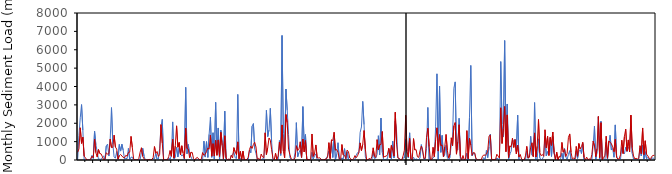
| Category | Observed (metric tons/month) | Baseline calibrated (metric tons/month) |
|---|---|---|
| 1984-01-01 | 18.237 | 419.9 |
| 1984-02-01 | 1337.725 | 606.7 |
| 1984-03-01 | 2298.175 | 1753 |
| 1984-04-01 | 3014.526 | 903.8 |
| 1984-05-01 | 1623.83 | 1238 |
| 1984-06-01 | 12.873 | 210 |
| 1984-07-01 | 5.92 | 122.1 |
| 1984-08-01 | 10.05 | 2.722 |
| 1984-09-01 | 2.417 | 1.407 |
| 1984-10-01 | 3.216 | 0.614 |
| 1984-11-01 | 3.013 | 53.38 |
| 1984-12-01 | 257.169 | 209.7 |
| 1985-01-01 | 74.372 | 113.1 |
| 1985-02-01 | 1566.892 | 1139 |
| 1985-03-01 | 822.888 | 398.6 |
| 1985-04-01 | 470.529 | 166.8 |
| 1985-05-01 | 28.497 | 567.2 |
| 1985-06-01 | 52.116 | 354.7 |
| 1985-07-01 | 27.138 | 331.9 |
| 1985-08-01 | 132.373 | 180.6 |
| 1985-09-01 | 226.883 | 13.53 |
| 1985-10-01 | 5.877 | 29.47 |
| 1985-11-01 | 768.31 | 397.5 |
| 1985-12-01 | 866.247 | 311.5 |
| 1986-01-01 | 215.453 | 342.7 |
| 1986-02-01 | 1116.618 | 1138 |
| 1986-03-01 | 2850.864 | 678.1 |
| 1986-04-01 | 862.45 | 688.6 |
| 1986-05-01 | 167.705 | 1350 |
| 1986-06-01 | 97.042 | 705.7 |
| 1986-07-01 | 460.945 | 594.3 |
| 1986-08-01 | 12.994 | 39.82 |
| 1986-09-01 | 843.506 | 238.8 |
| 1986-10-01 | 485.02 | 299.6 |
| 1986-11-01 | 856.746 | 219.2 |
| 1986-12-01 | 527.262 | 137.9 |
| 1987-01-01 | 35.62 | 118.7 |
| 1987-02-01 | 90.238 | 255.4 |
| 1987-03-01 | 72.475 | 211.9 |
| 1987-04-01 | 631.393 | 412.2 |
| 1987-05-01 | 22.27 | 424.9 |
| 1987-06-01 | 153.491 | 1284 |
| 1987-07-01 | 152.497 | 678.3 |
| 1987-08-01 | 7.005 | 54.03 |
| 1987-09-01 | 3.405 | 2.122 |
| 1987-10-01 | 2.306 | 3.298 |
| 1987-11-01 | 2.149 | 2.469 |
| 1987-12-01 | 34.902 | 86.29 |
| 1988-01-01 | 27.777 | 427.9 |
| 1988-02-01 | 425.847 | 665.7 |
| 1988-03-01 | 639.316 | 198.1 |
| 1988-04-01 | 218.288 | 60.49 |
| 1988-05-01 | 2.362 | 1.206 |
| 1988-06-01 | 1.218 | 0.077 |
| 1988-07-01 | 0.473 | 7.006 |
| 1988-08-01 | 4.261 | 31.86 |
| 1988-09-01 | 2.205 | 1.596 |
| 1988-10-01 | 0.387 | 34.88 |
| 1988-11-01 | 103.259 | 125.1 |
| 1988-12-01 | 60.123 | 730.8 |
| 1989-01-01 | 363.445 | 367.2 |
| 1989-02-01 | 50.415 | 465.2 |
| 1989-03-01 | 48.107 | 192.4 |
| 1989-04-01 | 637.109 | 304.9 |
| 1989-05-01 | 1825.149 | 1926 |
| 1989-06-01 | 2212.087 | 922.6 |
| 1989-07-01 | 62.816 | 12.87 |
| 1989-08-01 | 3.097 | 1.241 |
| 1989-09-01 | 1.41 | 11.61 |
| 1989-10-01 | 27.507 | 18.53 |
| 1989-11-01 | 125.078 | 191.8 |
| 1989-12-01 | 17.784 | 512.9 |
| 1990-01-01 | 261.853 | 204.4 |
| 1990-02-01 | 2072.555 | 1128 |
| 1990-03-01 | 17.161 | 104.1 |
| 1990-04-01 | 138.208 | 768.7 |
| 1990-05-01 | 689.327 | 1859 |
| 1990-06-01 | 169.718 | 696.1 |
| 1990-07-01 | 675.633 | 953.2 |
| 1990-08-01 | 336.939 | 283 |
| 1990-09-01 | 220.621 | 775.4 |
| 1990-10-01 | 284.828 | 376.6 |
| 1990-11-01 | 13.102 | 86.23 |
| 1990-12-01 | 3952.117 | 1732 |
| 1991-01-01 | 340.087 | 626.9 |
| 1991-02-01 | 844.513 | 596.7 |
| 1991-03-01 | 312.076 | 126.5 |
| 1991-04-01 | 180.951 | 418.4 |
| 1991-05-01 | 27.38 | 410.3 |
| 1991-06-01 | 16.947 | 80.86 |
| 1991-07-01 | 1.769 | 2.002 |
| 1991-08-01 | 1.899 | 101.6 |
| 1991-09-01 | 1.09 | 140.3 |
| 1991-10-01 | 0.7 | 53.04 |
| 1991-11-01 | 0.665 | 3.662 |
| 1991-12-01 | 0.873 | 59.4 |
| 1992-01-01 | 37.399 | 405 |
| 1992-02-01 | 1027.606 | 252.4 |
| 1992-03-01 | 159.155 | 307.5 |
| 1992-04-01 | 998.463 | 471 |
| 1992-05-01 | 143.149 | 650 |
| 1992-06-01 | 1396.945 | 588.2 |
| 1992-07-01 | 2331.04 | 1347 |
| 1992-08-01 | 144.429 | 208.6 |
| 1992-09-01 | 1483.442 | 888.5 |
| 1992-10-01 | 50.57 | 214.7 |
| 1992-11-01 | 3138.584 | 1065 |
| 1992-12-01 | 426.621 | 254.7 |
| 1993-01-01 | 1743.16 | 1092 |
| 1993-02-01 | 8.141 | 193.9 |
| 1993-03-01 | 1619.723 | 1502 |
| 1993-04-01 | 950.644 | 785.8 |
| 1993-05-01 | 5.236 | 49.13 |
| 1993-06-01 | 2658.913 | 1318 |
| 1993-07-01 | 21.796 | 117 |
| 1993-08-01 | 2.073 | 1.356 |
| 1993-09-01 | 1.396 | 49.4 |
| 1993-10-01 | 1.434 | 2.067 |
| 1993-11-01 | 246.705 | 260.4 |
| 1993-12-01 | 275.587 | 110.1 |
| 1994-01-01 | 445.244 | 674.2 |
| 1994-02-01 | 122.165 | 441.6 |
| 1994-03-01 | 74.811 | 283 |
| 1994-04-01 | 3568.841 | 986.3 |
| 1994-05-01 | 2.433 | 72.42 |
| 1994-06-01 | 93.152 | 467.5 |
| 1994-07-01 | 3.881 | 18.22 |
| 1994-08-01 | 20.778 | 479.4 |
| 1994-09-01 | 0.886 | 0.458 |
| 1994-10-01 | 0.61 | 0.022 |
| 1994-11-01 | 0.57 | 26.26 |
| 1994-12-01 | 5 | 142.9 |
| 1995-01-01 | 535.513 | 577.2 |
| 1995-02-01 | 392.208 | 753.8 |
| 1995-03-01 | 1841.769 | 630.3 |
| 1995-04-01 | 1983.535 | 840.8 |
| 1995-05-01 | 615.333 | 968.1 |
| 1995-06-01 | 354.996 | 705.9 |
| 1995-07-01 | 37.889 | 26.63 |
| 1995-08-01 | 4.166 | 94.13 |
| 1995-09-01 | 0.633 | 0.446 |
| 1995-10-01 | 1.318 | 325.3 |
| 1995-11-01 | 76.127 | 166.2 |
| 1995-12-01 | 0.723 | 123.2 |
| 1996-01-01 | 1155.987 | 1479 |
| 1996-02-01 | 2704.094 | 299.1 |
| 1996-03-01 | 1273.229 | 672.1 |
| 1996-04-01 | 1641.653 | 1199 |
| 1996-05-01 | 2811.416 | 1078 |
| 1996-06-01 | 988.713 | 560.3 |
| 1996-07-01 | 4.223 | 94.94 |
| 1996-08-01 | 1.374 | 4.724 |
| 1996-09-01 | 1.172 | 369.8 |
| 1996-10-01 | 0.633 | 15.13 |
| 1996-11-01 | 3.649 | 218.7 |
| 1996-12-01 | 1058.524 | 966.5 |
| 1997-01-01 | 252.333 | 364.1 |
| 1997-02-01 | 6775.143 | 1908 |
| 1997-03-01 | 1447.044 | 486.1 |
| 1997-04-01 | 486.074 | 115.9 |
| 1997-05-01 | 3863.677 | 2475 |
| 1997-06-01 | 2693.792 | 2036 |
| 1997-07-01 | 1394.294 | 590 |
| 1997-08-01 | 140.709 | 301.2 |
| 1997-09-01 | 32.709 | 71.19 |
| 1997-10-01 | 0.708 | 8.837 |
| 1997-11-01 | 11.701 | 9.434 |
| 1997-12-01 | 397.304 | 116.6 |
| 1998-01-01 | 2032.763 | 776.7 |
| 1998-02-01 | 168.952 | 515.4 |
| 1998-03-01 | 400.715 | 590.9 |
| 1998-04-01 | 551.67 | 990.3 |
| 1998-05-01 | 116.273 | 144.2 |
| 1998-06-01 | 2905.096 | 1142 |
| 1998-07-01 | 859.278 | 438.8 |
| 1998-08-01 | 1385.801 | 1055 |
| 1998-09-01 | 1.512 | 38.02 |
| 1998-10-01 | 0.769 | 20.65 |
| 1998-11-01 | 0.662 | 18.69 |
| 1998-12-01 | 1.14 | 41.98 |
| 1999-01-01 | 413.93 | 1415 |
| 1999-02-01 | 46.918 | 199.8 |
| 1999-03-01 | 229.77 | 367 |
| 1999-04-01 | 333.581 | 819.2 |
| 1999-05-01 | 1.808 | 116.9 |
| 1999-06-01 | 3.336 | 109.3 |
| 1999-07-01 | 23.599 | 122.4 |
| 1999-08-01 | 5.068 | 34.18 |
| 1999-09-01 | 1.106 | 8.473 |
| 1999-10-01 | 0.676 | 5.806 |
| 1999-11-01 | 0.648 | 39.5 |
| 1999-12-01 | 105.719 | 50.81 |
| 2000-01-01 | 218.759 | 167.3 |
| 2000-02-01 | 492.972 | 943.2 |
| 2000-03-01 | 85.375 | 81.26 |
| 2000-04-01 | 1000.089 | 1099 |
| 2000-05-01 | 139.279 | 1059 |
| 2000-06-01 | 1342.229 | 1511 |
| 2000-07-01 | 12.009 | 536.2 |
| 2000-08-01 | 316.447 | 566.3 |
| 2000-09-01 | 938.897 | 420.7 |
| 2000-10-01 | 50.026 | 59.12 |
| 2000-11-01 | 0.96 | 31.93 |
| 2000-12-01 | 119.751 | 841.3 |
| 2001-01-01 | 31.9 | 277.2 |
| 2001-02-01 | 620.581 | 254.5 |
| 2001-03-01 | 64.511 | 74.49 |
| 2001-04-01 | 447.293 | 539.2 |
| 2001-05-01 | 24.099 | 455.6 |
| 2001-06-01 | 6.391 | 107.4 |
| 2001-07-01 | 1.561 | 44.82 |
| 2001-08-01 | 0.935 | 1.397 |
| 2001-09-01 | 0.612 | 63.36 |
| 2001-10-01 | 27.783 | 239 |
| 2001-11-01 | 253.345 | 124.4 |
| 2001-12-01 | 400.697 | 231.4 |
| 2002-01-01 | 379.49 | 416.1 |
| 2002-02-01 | 1503.222 | 931.4 |
| 2002-03-01 | 1797.24 | 511.9 |
| 2002-04-01 | 3188.652 | 848.6 |
| 2002-05-01 | 1926.875 | 1601 |
| 2002-06-01 | 173.143 | 600.5 |
| 2002-07-01 | 1.725 | 1.224 |
| 2002-08-01 | 1.22 | 3.862 |
| 2002-09-01 | 1.986 | 93.11 |
| 2002-10-01 | 0.796 | 25.96 |
| 2002-11-01 | 9.597 | 179 |
| 2002-12-01 | 479.962 | 662.8 |
| 2003-01-01 | 87.147 | 203.1 |
| 2003-02-01 | 102.929 | 135.5 |
| 2003-03-01 | 307.796 | 1107 |
| 2003-04-01 | 1321.139 | 552.6 |
| 2003-05-01 | 284.193 | 831.8 |
| 2003-06-01 | 2282.287 | 842.7 |
| 2003-07-01 | 404.796 | 1550 |
| 2003-08-01 | 32.277 | 147.7 |
| 2003-09-01 | 10.973 | 199.7 |
| 2003-10-01 | 41.882 | 203.4 |
| 2003-11-01 | 64.875 | 292.9 |
| 2003-12-01 | 592.714 | 639.7 |
| 2004-01-01 | 480.92 | 122.7 |
| 2004-02-01 | 31.046 | 789.8 |
| 2004-03-01 | 1024.99 | 538.5 |
| 2004-04-01 | 110.072 | 209.4 |
| 2004-05-01 | 2108.749 | 2600 |
| 2004-06-01 | 1522.835 | 867.2 |
| 2004-07-01 | 135.156 | 110.9 |
| 2004-08-01 | 51.459 | 93.11 |
| 2004-09-01 | 0.923 | 8.294 |
| 2004-10-01 | 0.621 | 5.478 |
| 2004-11-01 | 116.252 | 225.7 |
| 2004-12-01 | 107.839 | 533.9 |
| 2005-01-01 | 1112.792 | 2432 |
| 2005-02-01 | 395.542 | 484.3 |
| 2005-03-01 | 117.081 | 161.7 |
| 2005-04-01 | 1477.958 | 1173 |
| 2005-05-01 | 6.426 | 60.74 |
| 2005-06-01 | 2.286 | 1.77 |
| 2005-07-01 | 153.909 | 1164 |
| 2005-08-01 | 4.252 | 543.5 |
| 2005-09-01 | 61.66 | 563.1 |
| 2005-10-01 | 27.626 | 175 |
| 2005-11-01 | 1.826 | 141.8 |
| 2005-12-01 | 111.142 | 501.8 |
| 2006-01-01 | 837.56 | 759.9 |
| 2006-02-01 | 433.977 | 554.8 |
| 2006-03-01 | 46.85 | 81.12 |
| 2006-04-01 | 14.796 | 100.5 |
| 2006-05-01 | 628.836 | 1236 |
| 2006-06-01 | 2857.52 | 1729 |
| 2006-07-01 | 41.612 | 728.1 |
| 2006-08-01 | 3.128 | 17.14 |
| 2006-09-01 | 0.909 | 9.707 |
| 2006-10-01 | 130.773 | 688.3 |
| 2006-11-01 | 168.737 | 183 |
| 2006-12-01 | 1839.277 | 1113 |
| 2007-01-01 | 4689.724 | 1751 |
| 2007-02-01 | 16.757 | 486.3 |
| 2007-03-01 | 4018.138 | 1379 |
| 2007-04-01 | 416.735 | 785.3 |
| 2007-05-01 | 1338.161 | 815.7 |
| 2007-06-01 | 168.63 | 185.7 |
| 2007-07-01 | 313.92 | 710.2 |
| 2007-08-01 | 795.094 | 1390 |
| 2007-09-01 | 143.284 | 517.5 |
| 2007-10-01 | 0.891 | 101.8 |
| 2007-11-01 | 128.274 | 335 |
| 2007-12-01 | 885.869 | 1209 |
| 2008-01-01 | 1225.207 | 777 |
| 2008-02-01 | 3905.095 | 1854 |
| 2008-03-01 | 4250.305 | 2038 |
| 2008-04-01 | 592.113 | 318.1 |
| 2008-05-01 | 542.516 | 997.3 |
| 2008-06-01 | 2270.933 | 1919 |
| 2008-07-01 | 70.439 | 206.5 |
| 2008-08-01 | 3.334 | 0.797 |
| 2008-09-01 | 72.558 | 244.9 |
| 2008-10-01 | 0.814 | 6.124 |
| 2008-11-01 | 32.698 | 52.33 |
| 2008-12-01 | 370.873 | 1598 |
| 2009-01-01 | 2.875 | 76.15 |
| 2009-02-01 | 2315.547 | 1182 |
| 2009-03-01 | 5144.702 | 813 |
| 2009-04-01 | 224.323 | 256.7 |
| 2009-05-01 | 369.754 | 412 |
| 2009-06-01 | 353.844 | 388.3 |
| 2009-07-01 | 3.25 | 74.79 |
| 2009-08-01 | 2.423 | 27.38 |
| 2009-09-01 | 0.829 | 3.336 |
| 2009-10-01 | 0.746 | 13.14 |
| 2009-11-01 | 0.496 | 1.578 |
| 2009-12-01 | 11.785 | 203 |
| 2010-01-01 | 131.592 | 280.1 |
| 2010-02-01 | 1.96 | 249.9 |
| 2010-03-01 | 522.604 | 316.2 |
| 2010-04-01 | 133.858 | 481.4 |
| 2010-05-01 | 716.59 | 1299 |
| 2010-06-01 | 1408.543 | 1357 |
| 2010-07-01 | 7.663 | 34.97 |
| 2010-08-01 | 3.689 | 18.24 |
| 2010-09-01 | 2.122 | 30.11 |
| 2010-10-01 | 0.844 | 21.24 |
| 2010-11-01 | 110.602 | 314 |
| 2010-12-01 | 50.045 | 212.1 |
| 2011-01-01 | 38.5 | 103.2 |
| 2011-02-01 | 5355.459 | 2841 |
| 2011-03-01 | 1952.153 | 900.4 |
| 2011-04-01 | 1260.131 | 1701 |
| 2011-05-01 | 6499.868 | 2913 |
| 2011-06-01 | 984.061 | 452.1 |
| 2011-07-01 | 3047.838 | 2454 |
| 2011-08-01 | 38.703 | 132.7 |
| 2011-09-01 | 323.215 | 768.9 |
| 2011-10-01 | 474.912 | 716.5 |
| 2011-11-01 | 1084.883 | 1183 |
| 2011-12-01 | 1021.548 | 685.2 |
| 2012-01-01 | 1137.2 | 1105 |
| 2012-02-01 | 471.784 | 333.9 |
| 2012-03-01 | 2441.156 | 809.4 |
| 2012-04-01 | 6.325 | 157.5 |
| 2012-05-01 | 5.877 | 301.4 |
| 2012-06-01 | 11.855 | 48.78 |
| 2012-07-01 | 2.324 | 3.523 |
| 2012-08-01 | 1.433 | 6.697 |
| 2012-09-01 | 2.644 | 222.9 |
| 2012-10-01 | 487.524 | 740.2 |
| 2012-11-01 | 86.284 | 116.3 |
| 2012-12-01 | 198.355 | 144.5 |
| 2013-01-01 | 1290.43 | 701.2 |
| 2013-02-01 | 262.147 | 936.6 |
| 2013-03-01 | 200.946 | 189.6 |
| 2013-04-01 | 3125.995 | 1474 |
| 2013-05-01 | 6.417 | 160.8 |
| 2013-06-01 | 10.761 | 746.4 |
| 2013-07-01 | 1148.902 | 2206 |
| 2013-08-01 | 129.622 | 409.7 |
| 2013-09-01 | 2.27 | 234 |
| 2013-10-01 | 49.329 | 301.9 |
| 2013-11-01 | 201.963 | 201.4 |
| 2013-12-01 | 1308.626 | 1645 |
| 2014-01-01 | 218.558 | 666.8 |
| 2014-02-01 | 460.622 | 1288 |
| 2014-03-01 | 435.365 | 246.1 |
| 2014-04-01 | 1185.687 | 1240 |
| 2014-05-01 | 194.892 | 795 |
| 2014-06-01 | 1277.788 | 1522 |
| 2014-07-01 | 334.628 | 411.8 |
| 2014-08-01 | 3.714 | 13.66 |
| 2014-09-01 | 13.771 | 421.8 |
| 2014-10-01 | 1.212 | 5.578 |
| 2014-11-01 | 8.838 | 202.9 |
| 2014-12-01 | 69.745 | 173.1 |
| 2015-01-01 | 370.343 | 956.3 |
| 2015-02-01 | 5.138 | 423.6 |
| 2015-03-01 | 624.38 | 580.1 |
| 2015-04-01 | 167.166 | 196.5 |
| 2015-05-01 | 23.558 | 363.8 |
| 2015-06-01 | 310.437 | 1231 |
| 2015-07-01 | 506.719 | 1419 |
| 2015-08-01 | 1.755 | 412.6 |
| 2015-09-01 | 1.266 | 65.34 |
| 2015-10-01 | 2.047 | 100.8 |
| 2015-11-01 | 1.302 | 66.64 |
| 2015-12-01 | 495.048 | 738 |
| 2016-01-01 | 85.357 | 203.4 |
| 2016-02-01 | 486.709 | 895.9 |
| 2016-03-01 | 571.907 | 602.3 |
| 2016-04-01 | 349.22 | 723.8 |
| 2016-05-01 | 887.674 | 965.1 |
| 2016-06-01 | 2.849 | 152.5 |
| 2016-07-01 | 1.121 | 4.211 |
| 2016-08-01 | 1.39 | 155.8 |
| 2016-09-01 | 1.087 | 11.16 |
| 2016-10-01 | 1.121 | 63.01 |
| 2016-11-01 | 0.768 | 4.13 |
| 2016-12-01 | 5.656 | 299.4 |
| 2017-01-01 | 822.731 | 1025 |
| 2017-02-01 | 1842.166 | 764.4 |
| 2017-03-01 | 38.19 | 181.7 |
| 2017-04-01 | 458.898 | 623 |
| 2017-05-01 | 2351.093 | 2371 |
| 2017-06-01 | 15.611 | 132.6 |
| 2017-07-01 | 2103.371 | 2028 |
| 2017-08-01 | 2.037 | 12.91 |
| 2017-09-01 | 1.278 | 112.5 |
| 2017-10-01 | 0.977 | 259.4 |
| 2017-11-01 | 965.035 | 1295 |
| 2017-12-01 | 3.284 | 97.03 |
| 2018-01-01 | 888.682 | 1025 |
| 2018-02-01 | 1345.565 | 970.6 |
| 2018-03-01 | 541.719 | 885.6 |
| 2018-04-01 | 624.114 | 716.7 |
| 2018-05-01 | 150.292 | 453.6 |
| 2018-06-01 | 1909.631 | 1119 |
| 2018-07-01 | 242.141 | 141.1 |
| 2018-08-01 | 2.408 | 50.73 |
| 2018-09-01 | 1.503 | 57.32 |
| 2018-10-01 | 45.092 | 285.8 |
| 2018-11-01 | 685.102 | 1078 |
| 2018-12-01 | 413.662 | 350.8 |
| 2019-01-01 | 332.085 | 1282 |
| 2019-02-01 | 694.71 | 1677 |
| 2019-03-01 | 460.825 | 481.8 |
| 2019-04-01 | 679.814 | 1091 |
| 2019-05-01 | 617.487 | 440 |
| 2019-06-01 | 1849.715 | 2443 |
| 2019-07-01 | 357.372 | 669.9 |
| 2019-08-01 | 47.879 | 218 |
| 2019-09-01 | 1.528 | 59.24 |
| 2019-10-01 | 8.551 | 88.73 |
| 2019-11-01 | 16.733 | 53.81 |
| 2019-12-01 | 58.105 | 93.67 |
| 2020-01-01 | 655.473 | 778.9 |
| 2020-02-01 | 222.008 | 337.4 |
| 2020-03-01 | 792.611 | 1743 |
| 2020-04-01 | 40.13 | 293.8 |
| 2020-05-01 | 451.297 | 1046 |
| 2020-06-01 | 69.409 | 315.6 |
| 2020-07-01 | 133.568 | 224.5 |
| 2020-08-01 | 3.082 | 92.65 |
| 2020-09-01 | 2.942 | 32.26 |
| 2020-10-01 | 107.505 | 194.9 |
| 2020-11-01 | 107.087 | 245.9 |
| 2020-12-01 | 72.338 | 254.3 |